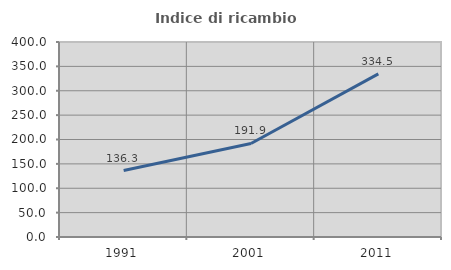
| Category | Indice di ricambio occupazionale  |
|---|---|
| 1991.0 | 136.31 |
| 2001.0 | 191.908 |
| 2011.0 | 334.483 |